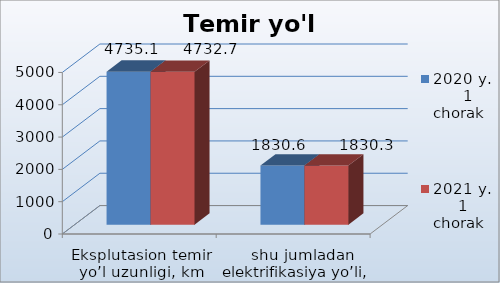
| Category | 2020 y.        1 chorak
 | 2021 y.       1 chorak
 |
|---|---|---|
| Eksplutasion temir yo’l uzunligi, km | 4735.1 | 4732.7 |
|    shu jumladan elektrifikasiya yo’li, km | 1830.6 | 1830.3 |